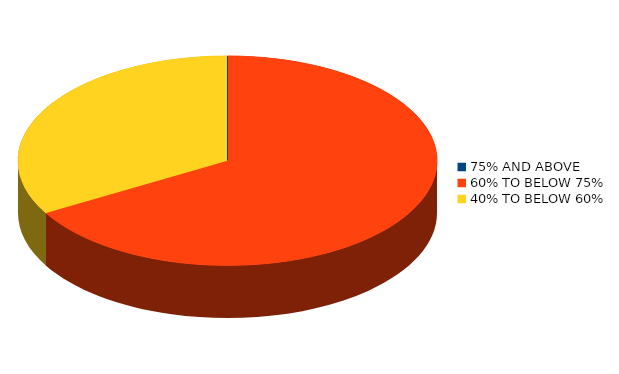
| Category | Number of students |
|---|---|
| 75% AND ABOVE | 0 |
| 60% TO BELOW 75% | 2 |
| 40% TO BELOW 60% | 1 |